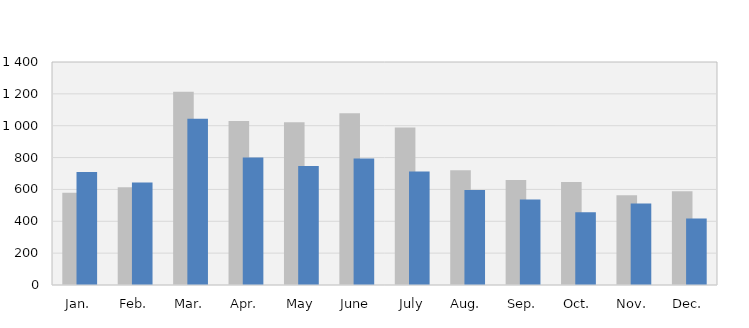
| Category | 2021 | 2022 |
|---|---|---|
| Jan. | 579 | 710 |
| Feb. | 614 | 644 |
| Mar. | 1214 | 1043 |
| Apr. | 1030 | 800 |
| May | 1022 | 747 |
| June | 1079 | 794 |
| July | 989 | 713 |
| Aug. | 721 | 597 |
| Sep. | 659 | 537 |
| Oct. | 646 | 457 |
| Nov. | 564 | 512 |
| Dec. | 589 | 418 |